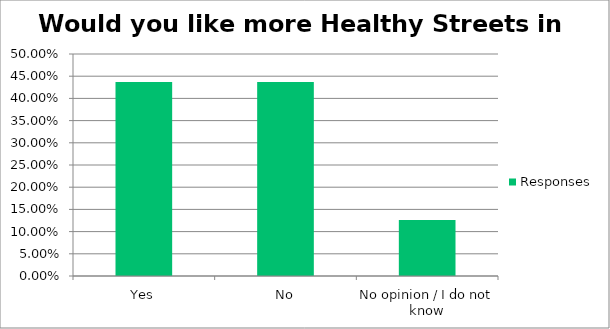
| Category | Responses |
|---|---|
| Yes | 0.437 |
| No | 0.437 |
| No opinion / I do not know | 0.126 |